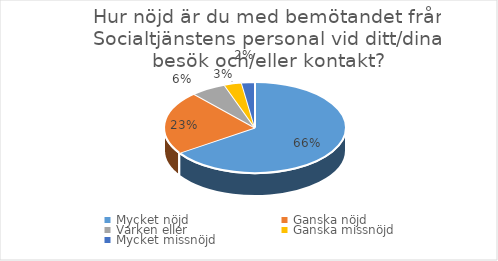
| Category | Series 0 |
|---|---|
| Mycket nöjd  | 84 |
| Ganska nöjd | 29 |
| Varken eller  | 8 |
| Ganska missnöjd | 4 |
| Mycket missnöjd  | 3 |